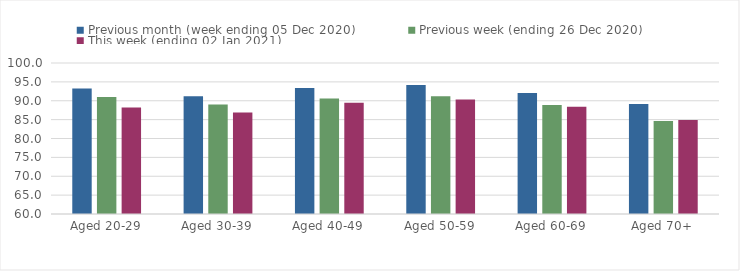
| Category | Previous month (week ending 05 Dec 2020) | Previous week (ending 26 Dec 2020) | This week (ending 02 Jan 2021) |
|---|---|---|---|
| Aged 20-29 | 93.27 | 91 | 88.19 |
| Aged 30-39 | 91.22 | 89.01 | 86.89 |
| Aged 40-49 | 93.38 | 90.58 | 89.47 |
| Aged 50-59 | 94.18 | 91.16 | 90.34 |
| Aged 60-69 | 92.06 | 88.9 | 88.44 |
| Aged 70+ | 89.12 | 84.63 | 84.92 |